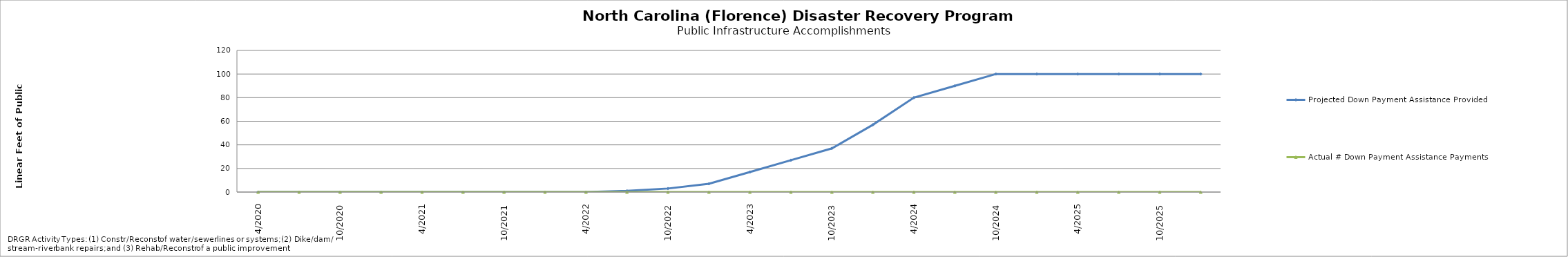
| Category | Projected Down Payment Assistance Provided | Actual # Down Payment Assistance Payments |
|---|---|---|
| 4/2020 | 0 | 0 |
| 7/2020 | 0 | 0 |
| 10/2020 | 0 | 0 |
| 1/2021 | 0 | 0 |
| 4/2021 | 0 | 0 |
| 7/2021 | 0 | 0 |
| 10/2021 | 0 | 0 |
| 1/2022 | 0 | 0 |
| 4/2022 | 0 | 0 |
| 7/2022 | 1 | 0 |
| 10/2022 | 3 | 0 |
| 1/2023 | 7 | 0 |
| 4/2023 | 17 | 0 |
| 7/2023 | 27 | 0 |
| 10/2023 | 37 | 0 |
| 1/2024 | 57 | 0 |
| 4/2024 | 80 | 0 |
| 7/2024 | 90 | 0 |
| 10/2024 | 100 | 0 |
| 1/2025 | 100 | 0 |
| 4/2025 | 100 | 0 |
| 7/2025 | 100 | 0 |
| 10/2025 | 100 | 0 |
| 1/2026 | 100 | 0 |